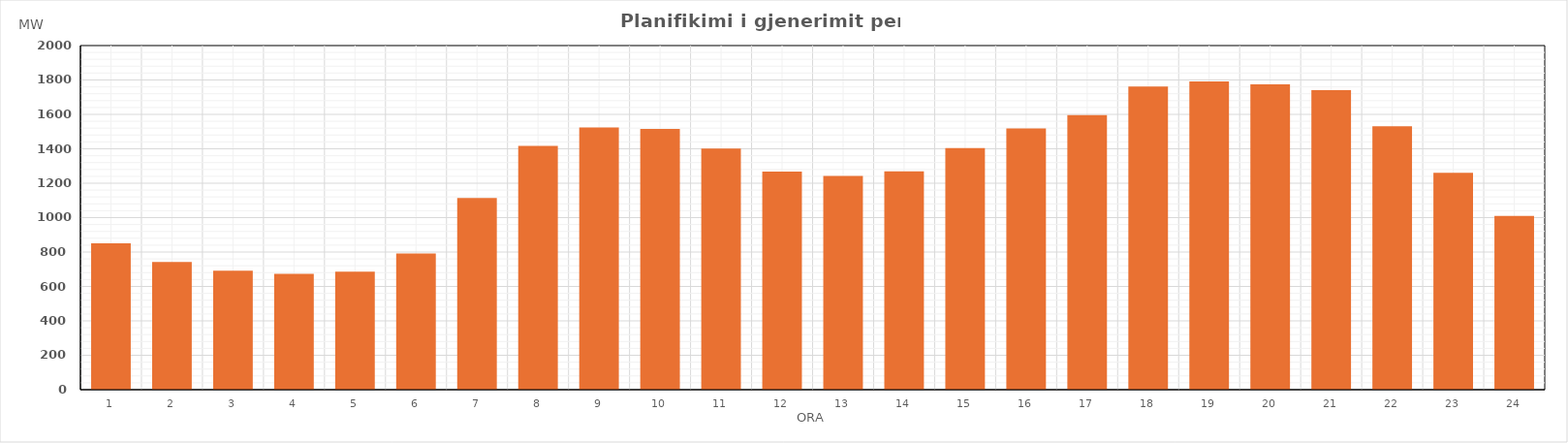
| Category | Max (MW) |
|---|---|
| 0 | 851.18 |
| 1 | 741.69 |
| 2 | 691.56 |
| 3 | 672.88 |
| 4 | 686.36 |
| 5 | 791.45 |
| 6 | 1114.39 |
| 7 | 1416.38 |
| 8 | 1523.56 |
| 9 | 1515.3 |
| 10 | 1401.35 |
| 11 | 1267.7 |
| 12 | 1242.59 |
| 13 | 1268.79 |
| 14 | 1403.79 |
| 15 | 1517.9 |
| 16 | 1596.22 |
| 17 | 1762.42 |
| 18 | 1791.73 |
| 19 | 1774.71 |
| 20 | 1741.17 |
| 21 | 1530.97 |
| 22 | 1261.06 |
| 23 | 1010.06 |